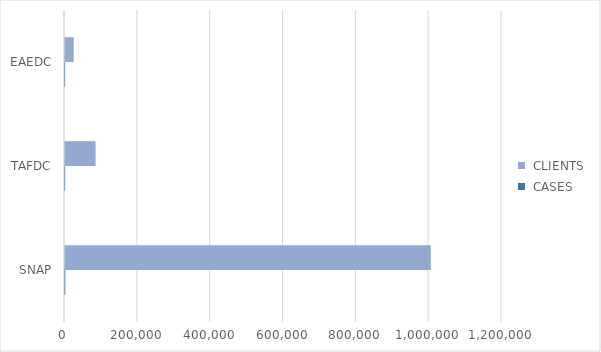
| Category |  CASES |  CLIENTS |
|---|---|---|
| SNAP | 749 | 1004501 |
| TAFDC | 310 | 83946 |
| EAEDC | 286 | 23933 |